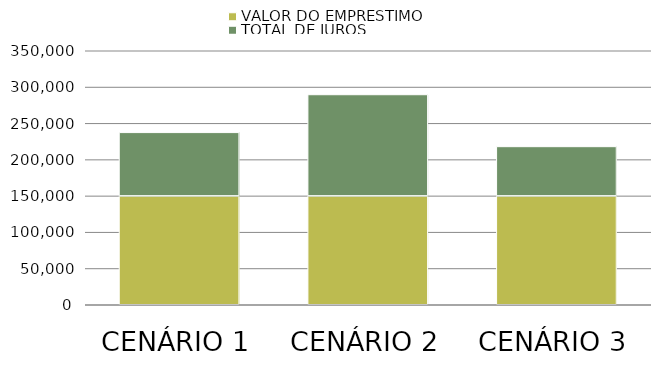
| Category | VALOR DO EMPRÉSTIMO | TOTAL DE JUROS |
|---|---|---|
| CENÁRIO 1 | 150000 | 87584.066 |
| CENÁRIO 2 | 150000 | 139753.762 |
| CENÁRIO 3 | 150000 | 68152.919 |